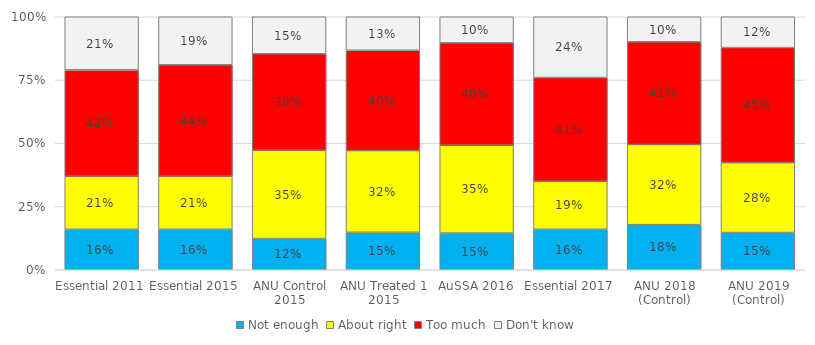
| Category | Not enough | About right | Too much | Don't know |
|---|---|---|---|---|
| Essential 2011 | 0.16 | 0.21 | 0.42 | 0.21 |
| Essential 2015 | 0.16 | 0.21 | 0.44 | 0.19 |
| ANU Control 2015 | 0.123 | 0.349 | 0.381 | 0.146 |
| ANU Treated 1 2015 | 0.148 | 0.323 | 0.397 | 0.132 |
| AuSSA 2016 | 0.145 | 0.347 | 0.404 | 0.103 |
| Essential 2017 | 0.16 | 0.19 | 0.41 | 0.24 |
| ANU 2018 (Control) | 0.18 | 0.32 | 0.41 | 0.1 |
| ANU 2019 (Control) | 0.147 | 0.276 | 0.455 | 0.122 |